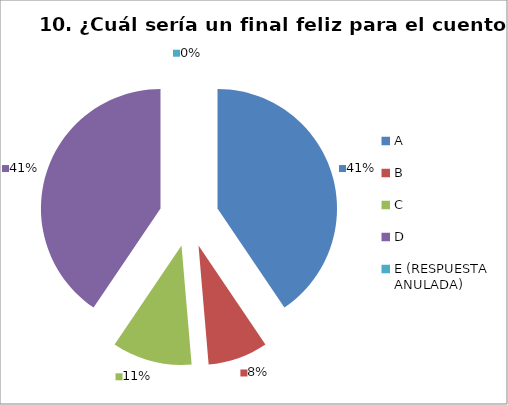
| Category | CANTIDAD DE RESPUESTAS PREGUNTA (10) | PORCENTAJE |
|---|---|---|
| A | 15 | 0.405 |
| B | 3 | 0.081 |
| C | 4 | 0.108 |
| D | 15 | 0.405 |
| E (RESPUESTA ANULADA) | 0 | 0 |